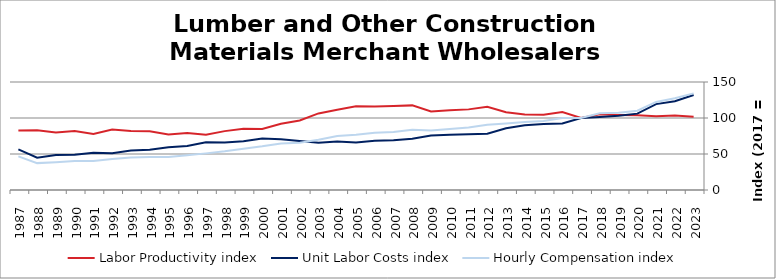
| Category | Labor Productivity index | Unit Labor Costs index | Hourly Compensation index |
|---|---|---|---|
| 2023.0 | 101.667 | 132.031 | 134.232 |
| 2022.0 | 103.324 | 123.225 | 127.32 |
| 2021.0 | 102.57 | 119.283 | 122.349 |
| 2020.0 | 103.868 | 106.074 | 110.177 |
| 2019.0 | 104.29 | 103.037 | 107.457 |
| 2018.0 | 105.139 | 101.364 | 106.573 |
| 2017.0 | 100 | 100 | 100 |
| 2016.0 | 108.212 | 92.421 | 100.011 |
| 2015.0 | 104.494 | 91.684 | 95.805 |
| 2014.0 | 104.854 | 90.081 | 94.454 |
| 2013.0 | 108.035 | 85.626 | 92.506 |
| 2012.0 | 115.701 | 78.226 | 90.508 |
| 2011.0 | 111.976 | 77.497 | 86.778 |
| 2010.0 | 110.718 | 76.575 | 84.783 |
| 2009.0 | 109.099 | 75.712 | 82.601 |
| 2008.0 | 117.531 | 71.253 | 83.745 |
| 2007.0 | 116.572 | 69.179 | 80.644 |
| 2006.0 | 115.96 | 68.475 | 79.404 |
| 2005.0 | 116.423 | 65.954 | 76.786 |
| 2004.0 | 111.544 | 67.303 | 75.073 |
| 2003.0 | 106.374 | 65.605 | 69.786 |
| 2002.0 | 96.492 | 68.166 | 65.774 |
| 2001.0 | 91.931 | 70.421 | 64.739 |
| 2000.0 | 84.707 | 71.619 | 60.666 |
| 1999.0 | 84.965 | 67.615 | 57.449 |
| 1998.0 | 81.78 | 65.805 | 53.815 |
| 1997.0 | 76.766 | 66.263 | 50.868 |
| 1996.0 | 79.044 | 61.084 | 48.283 |
| 1995.0 | 77.25 | 59.391 | 45.879 |
| 1994.0 | 81.734 | 55.952 | 45.732 |
| 1993.0 | 81.964 | 54.928 | 45.021 |
| 1992.0 | 83.919 | 51.194 | 42.961 |
| 1991.0 | 77.94 | 51.881 | 40.436 |
| 1990.0 | 81.923 | 49.096 | 40.221 |
| 1989.0 | 79.76 | 48.504 | 38.687 |
| 1988.0 | 83.049 | 44.956 | 37.335 |
| 1987.0 | 82.707 | 56.375 | 46.626 |